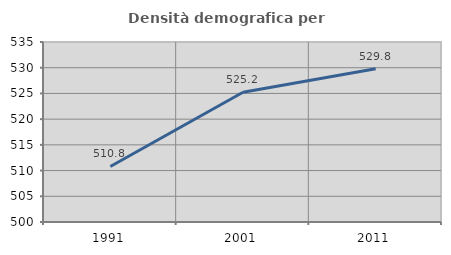
| Category | Densità demografica |
|---|---|
| 1991.0 | 510.796 |
| 2001.0 | 525.234 |
| 2011.0 | 529.785 |